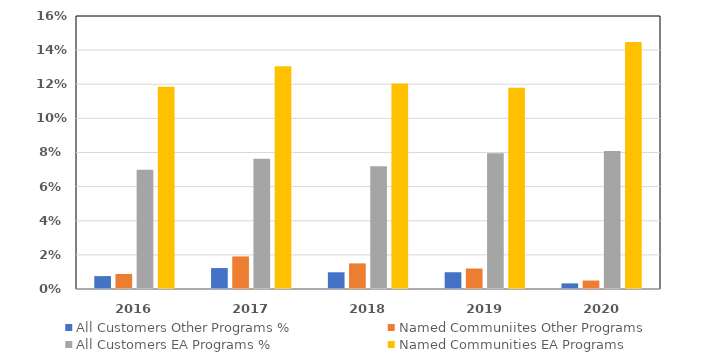
| Category | All Customers Other Programs % | Named Communiites Other Programs | All Customers EA Programs % | Named Communities EA Programs |
|---|---|---|---|---|
| 2016.0 | 0.008 | 0.009 | 0.07 | 0.119 |
| 2017.0 | 0.012 | 0.019 | 0.076 | 0.131 |
| 2018.0 | 0.01 | 0.015 | 0.072 | 0.12 |
| 2019.0 | 0.01 | 0.012 | 0.079 | 0.118 |
| 2020.0 | 0.003 | 0.005 | 0.081 | 0.145 |